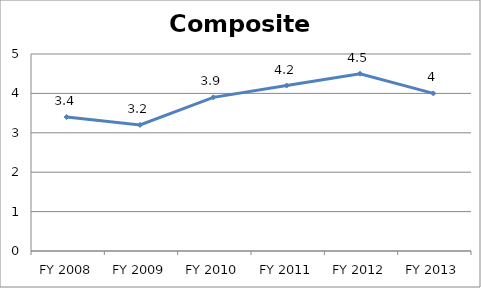
| Category | Composite score |
|---|---|
| FY 2013 | 4 |
| FY 2012 | 4.5 |
| FY 2011 | 4.2 |
| FY 2010 | 3.9 |
| FY 2009 | 3.2 |
| FY 2008 | 3.4 |